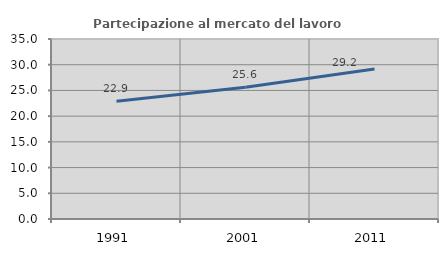
| Category | Partecipazione al mercato del lavoro  femminile |
|---|---|
| 1991.0 | 22.897 |
| 2001.0 | 25.604 |
| 2011.0 | 29.167 |